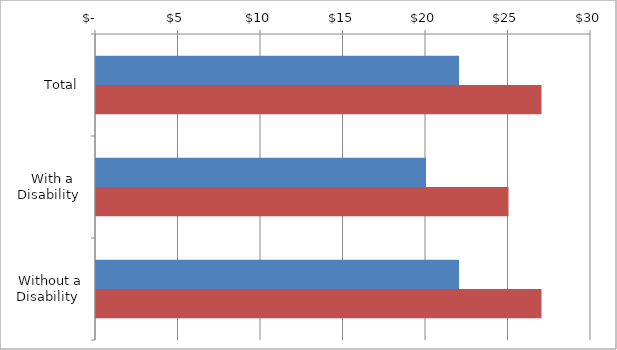
| Category | Series 0 | Series 1 |
|---|---|---|
| Total | 22 | 27 |
|  With a Disability  | 20 | 25 |
|  Without a Disability  | 22 | 27 |